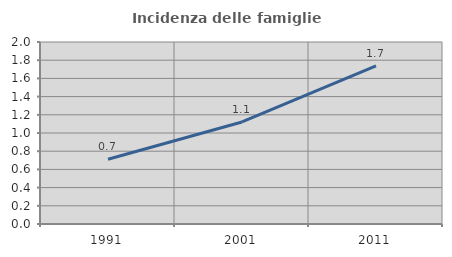
| Category | Incidenza delle famiglie numerose |
|---|---|
| 1991.0 | 0.711 |
| 2001.0 | 1.121 |
| 2011.0 | 1.737 |